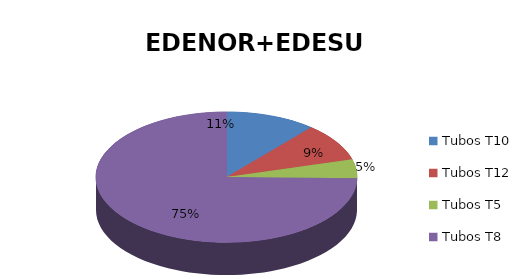
| Category | Series 0 |
|---|---|
| Tubos T10 | 4844 |
| Tubos T12 | 4077 |
| Tubos T5 | 2015 |
| Tubos T8 | 32364 |